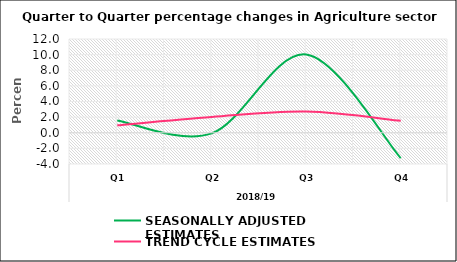
| Category | SEASONALLY ADJUSTED ESTIMATES | TREND CYCLE ESTIMATES |
|---|---|---|
| 0 | 1.57 | 0.952 |
| 1 | -0.086 | 2.017 |
| 2 | 10.017 | 2.705 |
| 3 | -3.251 | 1.534 |